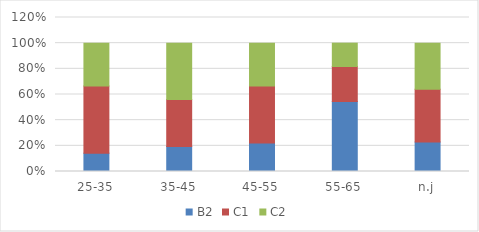
| Category | B2 | C1 | C2 |
|---|---|---|---|
| 25-35 | 0.143 | 0.524 | 0.333 |
| 35-45 | 0.195 | 0.366 | 0.439 |
| 45-55 | 0.222 | 0.444 | 0.333 |
| 55-65 | 0.545 | 0.273 | 0.182 |
| n.j | 0.23 | 0.41 | 0.36 |